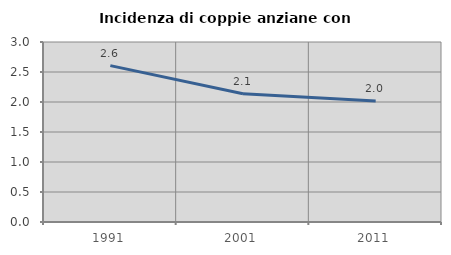
| Category | Incidenza di coppie anziane con figli |
|---|---|
| 1991.0 | 2.607 |
| 2001.0 | 2.137 |
| 2011.0 | 2.015 |